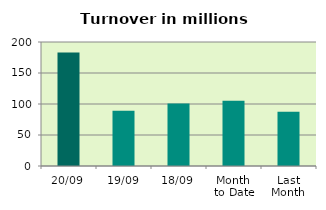
| Category | Series 0 |
|---|---|
| 20/09 | 183.118 |
| 19/09 | 89.034 |
| 18/09 | 100.823 |
| Month 
to Date | 105.051 |
| Last
Month | 87.619 |